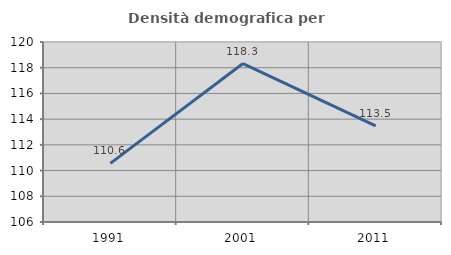
| Category | Densità demografica |
|---|---|
| 1991.0 | 110.562 |
| 2001.0 | 118.325 |
| 2011.0 | 113.481 |